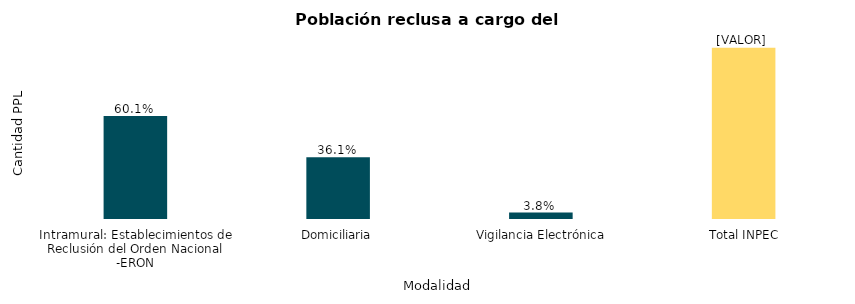
| Category | Total PPL |
|---|---|
| Intramural: Establecimientos de Reclusión del Orden Nacional -ERON | 101781 |
| Domiciliaria | 61191 |
|  Vigilancia Electrónica | 6423 |
|  Total INPEC | 169395 |